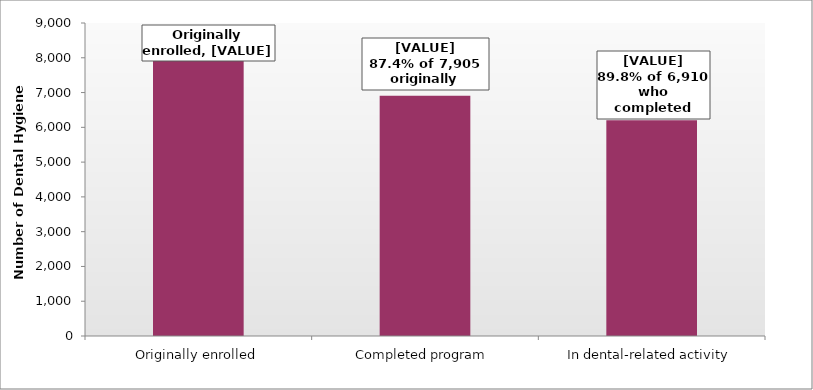
| Category | Series 0 |
|---|---|
| Originally enrolled | 7905 |
| Completed program | 6910 |
| In dental-related activity | 6203 |